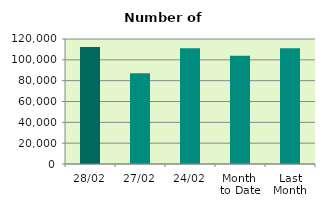
| Category | Series 0 |
|---|---|
| 28/02 | 112256 |
| 27/02 | 87054 |
| 24/02 | 111094 |
| Month 
to Date | 103910.7 |
| Last
Month | 111077.545 |